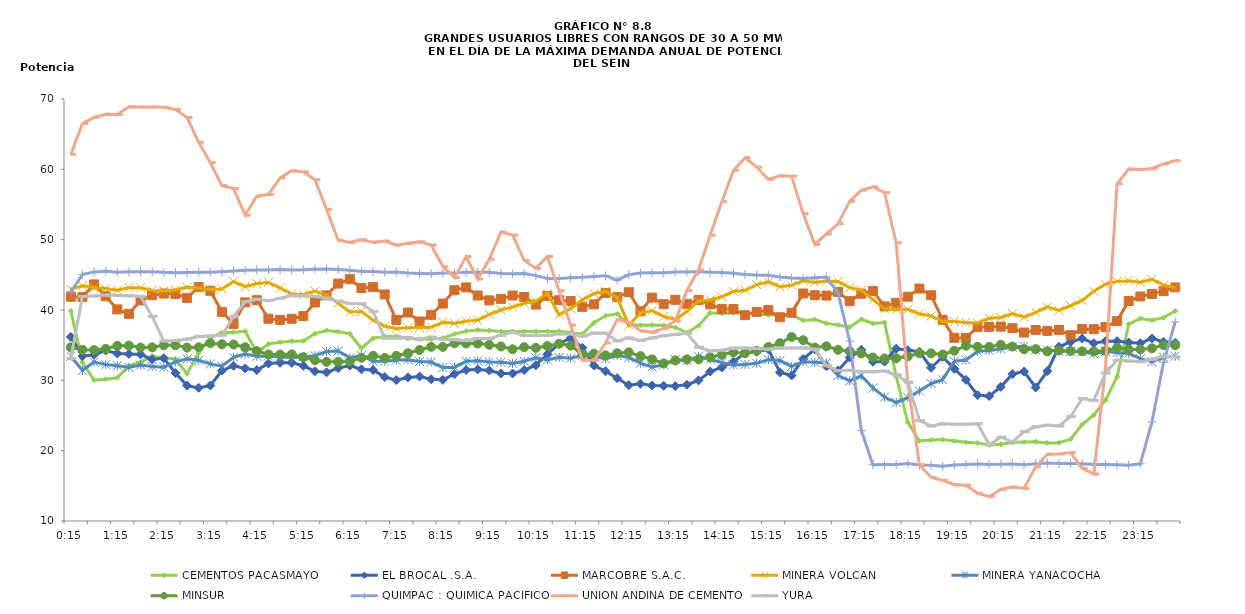
| Category | CEMENTOS PACASMAYO | EL BROCAL .S.A. | MARCOBRE S.A.C. | MINERA VOLCAN | MINERA YANACOCHA | MINSUR | QUIMPAC : QUIMICA PACIFICO | UNION ANDINA DE CEMENTO | YURA |
|---|---|---|---|---|---|---|---|---|---|
| 2013-03-14 00:15:00 | 39.87 | 36.18 | 41.89 | 42.96 | 33.43 | 34.69 | 42.59 | 62.13 | 33.1 |
| 2013-03-14 00:30:00 | 32.54 | 33.45 | 41.85 | 43.43 | 31.42 | 34.35 | 45.03 | 66.51 | 41.91 |
| 2013-03-14 00:45:00 | 30.03 | 33.62 | 43.64 | 43.2 | 32.59 | 34.3 | 45.42 | 67.37 | 41.98 |
| 2013-03-14 01:00:00 | 30.17 | 34.24 | 41.95 | 43.05 | 32.24 | 34.48 | 45.5 | 67.83 | 42.12 |
| 2013-03-14 01:15:00 | 30.37 | 33.82 | 40.09 | 42.82 | 32.09 | 34.9 | 45.38 | 67.78 | 42.06 |
| 2013-03-14 01:30:00 | 32.05 | 33.75 | 39.45 | 43.18 | 31.83 | 34.94 | 45.43 | 68.89 | 42.02 |
| 2013-03-14 01:45:00 | 32.58 | 33.69 | 41.37 | 43.16 | 32.18 | 34.67 | 45.45 | 68.85 | 41.92 |
| 2013-03-14 02:00:00 | 33.47 | 32.97 | 42.1 | 42.78 | 31.97 | 34.69 | 45.45 | 68.88 | 39.09 |
| 2013-03-14 02:15:00 | 33.13 | 33.15 | 42.34 | 42.72 | 31.87 | 34.98 | 45.35 | 68.83 | 35.59 |
| 2013-03-14 02:30:00 | 33.02 | 31.05 | 42.26 | 42.88 | 32.63 | 34.99 | 45.29 | 68.51 | 35.66 |
| 2013-03-14 02:45:00 | 30.95 | 29.25 | 41.72 | 43.24 | 33.05 | 34.66 | 45.32 | 67.37 | 35.85 |
| 2013-03-14 03:00:00 | 33.87 | 28.93 | 43.26 | 43.11 | 32.86 | 34.7 | 45.38 | 63.84 | 36.23 |
| 2013-03-14 03:15:00 | 36.05 | 29.26 | 42.74 | 42.96 | 32.34 | 35.29 | 45.35 | 60.95 | 36.32 |
| 2013-03-14 03:30:00 | 36.77 | 31.39 | 39.73 | 43 | 32.01 | 35.13 | 45.45 | 57.68 | 36.41 |
| 2013-03-14 03:45:00 | 36.83 | 32.07 | 38.01 | 44.04 | 33.29 | 35.09 | 45.55 | 57.27 | 39.1 |
| 2013-03-14 04:00:00 | 36.98 | 31.69 | 41.08 | 43.31 | 33.75 | 34.72 | 45.64 | 53.47 | 41.17 |
| 2013-03-14 04:15:00 | 33.92 | 31.45 | 41.39 | 43.76 | 33.43 | 34.15 | 45.69 | 56.2 | 41.54 |
| 2013-03-14 04:30:00 | 35.17 | 32.4 | 38.76 | 43.92 | 33.45 | 33.69 | 45.7 | 56.45 | 41.33 |
| 2013-03-14 04:45:00 | 35.41 | 32.49 | 38.59 | 43.13 | 33.3 | 33.67 | 45.75 | 58.78 | 41.67 |
| 2013-03-14 05:00:00 | 35.55 | 32.49 | 38.75 | 42.28 | 33.23 | 33.7 | 45.69 | 59.81 | 42.05 |
| 2013-03-14 05:15:00 | 35.58 | 32.07 | 39.13 | 42.18 | 33.33 | 33.3 | 45.73 | 59.64 | 42.02 |
| 2013-03-14 05:30:00 | 36.65 | 31.29 | 41.06 | 42.7 | 33.5 | 32.86 | 45.81 | 58.52 | 41.93 |
| 2013-03-14 05:45:00 | 37.09 | 31.13 | 42.08 | 42.11 | 34.09 | 32.63 | 45.84 | 54.31 | 41.66 |
| 2013-03-14 06:00:00 | 36.92 | 31.74 | 43.76 | 40.97 | 34.17 | 32.63 | 45.76 | 49.93 | 41.23 |
| 2013-03-14 06:15:00 | 36.61 | 32.1 | 44.38 | 39.73 | 33.19 | 32.67 | 45.65 | 49.61 | 40.93 |
| 2013-03-14 06:30:00 | 34.56 | 31.57 | 43.13 | 39.79 | 33.54 | 33.2 | 45.49 | 49.99 | 40.9 |
| 2013-03-14 06:45:00 | 35.98 | 31.47 | 43.26 | 38.54 | 32.73 | 33.5 | 45.46 | 49.62 | 39.8 |
| 2013-03-14 07:00:00 | 36.22 | 30.47 | 42.21 | 37.72 | 32.7 | 33.19 | 45.37 | 49.81 | 35.99 |
| 2013-03-14 07:15:00 | 36.26 | 30.03 | 38.59 | 37.35 | 32.86 | 33.49 | 45.41 | 49.22 | 36 |
| 2013-03-14 07:30:00 | 35.98 | 30.41 | 39.64 | 37.47 | 32.92 | 33.86 | 45.26 | 49.48 | 36.07 |
| 2013-03-14 07:45:00 | 35.83 | 30.54 | 38.37 | 37.51 | 32.68 | 34.32 | 45.2 | 49.69 | 35.84 |
| 2013-03-14 08:00:00 | 35.86 | 30.15 | 39.31 | 37.54 | 32.6 | 34.76 | 45.17 | 49.23 | 36.15 |
| 2013-03-14 08:15:00 | 36 | 30.07 | 40.92 | 38.25 | 31.82 | 34.75 | 45.26 | 46.19 | 35.8 |
| 2013-03-14 08:30:00 | 36.57 | 30.88 | 42.81 | 38.1 | 31.84 | 35.26 | 45.27 | 44.6 | 35.78 |
| 2013-03-14 08:45:00 | 36.99 | 31.46 | 43.21 | 38.39 | 32.71 | 35.26 | 45.35 | 47.58 | 35.66 |
| 2013-03-14 09:00:00 | 37.16 | 31.55 | 42.06 | 38.56 | 32.77 | 35.23 | 45.35 | 44.4 | 35.96 |
| 2013-03-14 09:15:00 | 37.08 | 31.4 | 41.37 | 39.38 | 32.6 | 35.05 | 45.36 | 47.21 | 35.95 |
| 2013-03-14 09:30:00 | 36.94 | 30.97 | 41.58 | 40.02 | 32.56 | 34.81 | 45.2 | 51.08 | 36.39 |
| 2013-03-14 09:45:00 | 36.96 | 30.97 | 42.06 | 40.42 | 32.41 | 34.42 | 45.14 | 50.65 | 36.84 |
| 2013-03-14 10:00:00 | 36.95 | 31.46 | 41.85 | 40.95 | 32.71 | 34.72 | 45.2 | 47.06 | 36.36 |
| 2013-03-14 10:15:00 | 36.96 | 32.15 | 40.77 | 41.24 | 33.21 | 34.62 | 44.89 | 45.92 | 36.41 |
| 2013-03-14 10:30:00 | 36.96 | 33.71 | 42 | 42.33 | 32.9 | 34.88 | 44.49 | 47.61 | 36.38 |
| 2013-03-14 10:45:00 | 36.98 | 35.22 | 41.4 | 39.32 | 33.27 | 35.2 | 44.47 | 42.72 | 36.62 |
| 2013-03-14 11:00:00 | 36.82 | 36.01 | 41.28 | 40.18 | 33.15 | 34.93 | 44.58 | 37.85 | 36.59 |
| 2013-03-14 11:15:00 | 36.56 | 34.63 | 40.45 | 41.44 | 33.53 | 33.69 | 44.64 | 32.87 | 36.29 |
| 2013-03-14 11:30:00 | 38.18 | 32.11 | 40.8 | 42.31 | 33.44 | 33.79 | 44.78 | 32.83 | 36.73 |
| 2013-03-14 11:45:00 | 39.17 | 31.29 | 42.43 | 42.66 | 33.05 | 33.56 | 44.88 | 35.3 | 36.7 |
| 2013-03-14 12:00:00 | 39.45 | 30.3 | 41.83 | 41.76 | 33.57 | 33.85 | 44.24 | 38.63 | 35.6 |
| 2013-03-14 12:15:00 | 37.94 | 29.31 | 42.53 | 37.83 | 33.24 | 33.98 | 45.03 | 38.24 | 36.03 |
| 2013-03-14 12:30:00 | 37.83 | 29.51 | 39.83 | 39.59 | 32.45 | 33.45 | 45.26 | 37.04 | 35.67 |
| 2013-03-14 12:45:00 | 37.85 | 29.28 | 41.76 | 39.88 | 31.9 | 32.99 | 45.3 | 36.83 | 36.02 |
| 2013-03-14 13:00:00 | 37.81 | 29.22 | 40.83 | 39.08 | 32.2 | 32.41 | 45.31 | 37.39 | 36.34 |
| 2013-03-14 13:15:00 | 37.52 | 29.18 | 41.44 | 38.64 | 32.93 | 32.83 | 45.4 | 38.48 | 36.53 |
| 2013-03-14 13:30:00 | 36.76 | 29.38 | 40.86 | 39.78 | 32.77 | 32.98 | 45.39 | 42.79 | 36.68 |
| 2013-03-14 13:45:00 | 37.77 | 29.99 | 41.42 | 41.25 | 33.42 | 32.99 | 45.47 | 45.72 | 34.7 |
| 2013-03-14 14:00:00 | 39.61 | 31.25 | 40.79 | 41.43 | 33 | 33.28 | 45.38 | 50.64 | 34.19 |
| 2013-03-14 14:15:00 | 39.5 | 31.83 | 40.15 | 41.88 | 32.52 | 33.63 | 45.32 | 55.4 | 34.28 |
| 2013-03-14 14:30:00 | 39.58 | 32.66 | 40.14 | 42.63 | 32.18 | 33.99 | 45.22 | 59.84 | 34.58 |
| 2013-03-14 14:45:00 | 39.57 | 33.91 | 39.27 | 42.8 | 32.26 | 33.86 | 45.05 | 61.65 | 34.59 |
| 2013-03-14 15:00:00 | 39.45 | 34.07 | 39.72 | 43.61 | 32.43 | 34.2 | 44.96 | 60.32 | 34.54 |
| 2013-03-14 15:15:00 | 39.29 | 34.42 | 39.99 | 43.99 | 32.94 | 34.74 | 44.93 | 58.55 | 34.42 |
| 2013-03-14 15:30:00 | 39.31 | 31.14 | 38.97 | 43.32 | 32.81 | 35.28 | 44.69 | 59.07 | 34.6 |
| 2013-03-14 15:45:00 | 39.28 | 30.69 | 39.61 | 43.51 | 31.98 | 36.17 | 44.54 | 59.03 | 34.58 |
| 2013-03-14 16:00:00 | 38.52 | 33.04 | 42.35 | 44.16 | 32.64 | 35.71 | 44.48 | 53.7 | 34.61 |
| 2013-03-14 16:15:00 | 38.64 | 34.41 | 42.1 | 43.92 | 32.56 | 34.66 | 44.59 | 49.32 | 34.43 |
| 2013-03-14 16:30:00 | 38.1 | 31.99 | 42.05 | 44.11 | 32.49 | 34.84 | 44.69 | 50.81 | 32.08 |
| 2013-03-14 16:45:00 | 37.86 | 31.4 | 42.58 | 44.06 | 30.68 | 34.34 | 42.4 | 52.27 | 31.35 |
| 2013-03-14 17:00:00 | 37.56 | 33.24 | 41.26 | 43.18 | 29.92 | 34.14 | 35.57 | 55.44 | 31.43 |
| 2013-03-14 17:15:00 | 38.68 | 34.35 | 42.32 | 42.84 | 30.64 | 33.81 | 22.86 | 57.04 | 31.25 |
| 2013-03-14 17:30:00 | 38.1 | 32.64 | 42.71 | 41.48 | 28.91 | 33.25 | 18 | 57.52 | 31.22 |
| 2013-03-14 17:45:00 | 38.22 | 32.66 | 40.51 | 40.17 | 27.62 | 33.11 | 18.02 | 56.69 | 31.32 |
| 2013-03-14 18:00:00 | 30.57 | 34.5 | 41.01 | 40.05 | 26.85 | 33.14 | 18.02 | 49.54 | 30.79 |
| 2013-03-14 18:15:00 | 24.03 | 34.28 | 41.89 | 40.1 | 27.55 | 33.41 | 18.16 | 29.67 | 29.75 |
| 2013-03-14 18:30:00 | 21.38 | 34.07 | 43.05 | 39.46 | 28.48 | 33.86 | 17.96 | 18.01 | 24.27 |
| 2013-03-14 18:45:00 | 21.51 | 31.79 | 42.1 | 39.15 | 29.55 | 33.84 | 17.93 | 16.19 | 23.51 |
| 2013-03-14 19:00:00 | 21.57 | 33.34 | 38.6 | 38.36 | 30.1 | 33.69 | 17.77 | 15.77 | 23.81 |
| 2013-03-14 19:15:00 | 21.38 | 31.64 | 36.05 | 38.36 | 32.71 | 34.21 | 17.96 | 15.16 | 23.74 |
| 2013-03-14 19:30:00 | 21.21 | 30.07 | 36.03 | 38.21 | 32.9 | 34.93 | 18.03 | 15.09 | 23.76 |
| 2013-03-14 19:45:00 | 21.1 | 27.9 | 37.59 | 38.14 | 34.11 | 34.77 | 18.11 | 13.94 | 23.83 |
| 2013-03-14 20:00:00 | 20.82 | 27.76 | 37.59 | 38.82 | 34.25 | 34.77 | 18.05 | 13.46 | 20.84 |
| 2013-03-14 20:15:00 | 20.91 | 29.07 | 37.64 | 38.94 | 34.47 | 35.06 | 18.08 | 14.49 | 21.92 |
| 2013-03-14 20:30:00 | 21.15 | 30.88 | 37.41 | 39.5 | 34.75 | 34.81 | 18.1 | 14.84 | 21.25 |
| 2013-03-14 20:45:00 | 21.22 | 31.25 | 36.79 | 38.98 | 34.85 | 34.42 | 18 | 14.64 | 22.68 |
| 2013-03-14 21:00:00 | 21.27 | 28.98 | 37.15 | 39.67 | 34.35 | 34.44 | 18.13 | 17.71 | 23.4 |
| 2013-03-14 21:15:00 | 21.1 | 31.31 | 37.03 | 40.44 | 34.31 | 34.12 | 18.23 | 19.49 | 23.62 |
| 2013-03-14 21:30:00 | 21.12 | 34.77 | 37.16 | 39.93 | 34.17 | 34.26 | 18.17 | 19.54 | 23.51 |
| 2013-03-14 21:45:00 | 21.62 | 35.47 | 36.42 | 40.62 | 34.11 | 34.18 | 18.18 | 19.73 | 24.85 |
| 2013-03-14 22:00:00 | 23.71 | 35.94 | 37.31 | 41.37 | 34.06 | 34.12 | 18.14 | 17.49 | 27.41 |
| 2013-03-14 22:15:00 | 25.07 | 35.28 | 37.27 | 42.67 | 33.76 | 34.11 | 18.04 | 16.67 | 27.12 |
| 2013-03-14 22:30:00 | 27.16 | 35.55 | 37.57 | 43.66 | 34.09 | 34.21 | 18.03 | 31.72 | 31.03 |
| 2013-03-14 22:45:00 | 30.48 | 35.58 | 38.42 | 44.07 | 33.95 | 34.64 | 18.01 | 57.94 | 32.84 |
| 2013-03-14 23:00:00 | 37.98 | 35.38 | 41.28 | 44.14 | 33.83 | 34.39 | 17.92 | 60.05 | 32.76 |
| 2013-03-14 23:15:00 | 38.8 | 35.27 | 41.92 | 43.94 | 33.09 | 34.4 | 18.13 | 59.98 | 32.64 |
| 2013-03-14 23:30:00 | 38.54 | 35.96 | 42.29 | 44.37 | 32.65 | 34.55 | 24.07 | 60.11 | 32.99 |
| 2013-03-14 23:45:00 | 38.92 | 35.47 | 42.69 | 43.56 | 33.27 | 35.01 | 32.56 | 60.77 | 33.41 |
| 2013-03-15 | 39.85 | 35.33 | 43.21 | 43.18 | 33.43 | 34.99 | 38.32 | 61.22 | 33.32 |